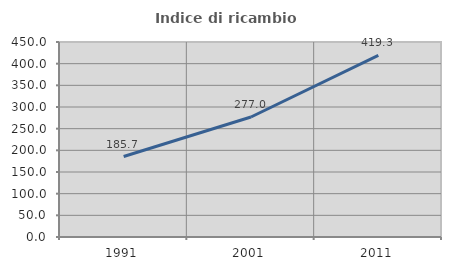
| Category | Indice di ricambio occupazionale  |
|---|---|
| 1991.0 | 185.714 |
| 2001.0 | 276.969 |
| 2011.0 | 419.315 |